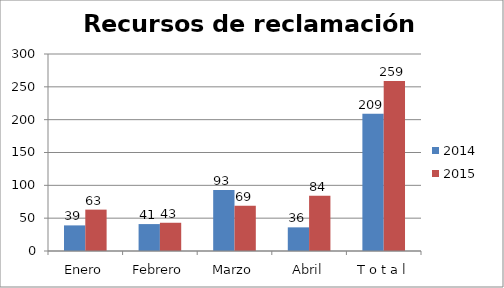
| Category | 2014 | 2015 |
|---|---|---|
| Enero | 39 | 63 |
| Febrero | 41 | 43 |
| Marzo | 93 | 69 |
| Abril | 36 | 84 |
| T o t a l | 209 | 259 |